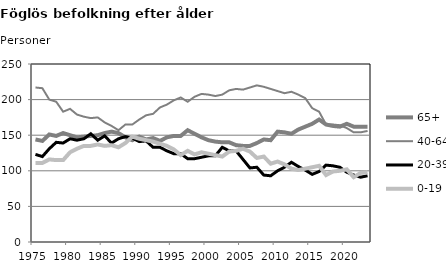
| Category | 65+ | 40-64 | 20-39 | 0-19 |
|---|---|---|---|---|
| 1975.0 | 144 | 217 | 123 | 111 |
| 1976.0 | 142 | 216 | 120 | 111 |
| 1977.0 | 151 | 200 | 131 | 116 |
| 1978.0 | 149 | 197 | 140 | 115 |
| 1979.0 | 153 | 183 | 139 | 115 |
| 1980.0 | 150 | 187 | 145 | 126 |
| 1981.0 | 147 | 179 | 143 | 131 |
| 1982.0 | 148 | 176 | 145 | 135 |
| 1983.0 | 149 | 174 | 152 | 135 |
| 1984.0 | 150 | 175 | 143 | 137 |
| 1985.0 | 153 | 168 | 149 | 135 |
| 1986.0 | 155 | 163 | 139 | 136 |
| 1987.0 | 153 | 157 | 145 | 133 |
| 1988.0 | 147 | 165 | 148 | 139 |
| 1989.0 | 143 | 165 | 146 | 148 |
| 1990.0 | 148 | 172 | 141 | 145 |
| 1991.0 | 144 | 178 | 142 | 143 |
| 1992.0 | 146 | 180 | 133 | 141 |
| 1993.0 | 142 | 189 | 133 | 138 |
| 1994.0 | 147 | 193 | 128 | 135 |
| 1995.0 | 149 | 199 | 124 | 130 |
| 1996.0 | 149 | 203 | 124 | 122 |
| 1997.0 | 157 | 197 | 117 | 128 |
| 1998.0 | 152 | 204 | 117 | 123 |
| 1999.0 | 147 | 208 | 119 | 126 |
| 2000.0 | 143 | 207 | 121 | 124 |
| 2001.0 | 141 | 205 | 121 | 122 |
| 2002.0 | 140 | 207 | 133 | 120 |
| 2003.0 | 140 | 213 | 128 | 127 |
| 2004.0 | 136 | 215 | 128 | 128 |
| 2005.0 | 135 | 214 | 116 | 131 |
| 2006.0 | 135 | 217 | 104 | 127 |
| 2007.0 | 139 | 220 | 105 | 118 |
| 2008.0 | 144 | 218 | 94 | 120 |
| 2009.0 | 143 | 215 | 93 | 110 |
| 2010.0 | 155 | 212 | 100 | 113 |
| 2011.0 | 154 | 209 | 105 | 109 |
| 2012.0 | 152 | 211 | 112 | 103 |
| 2013.0 | 158 | 207 | 106 | 101 |
| 2014.0 | 162 | 202 | 101 | 103 |
| 2015.0 | 166 | 188 | 95 | 105 |
| 2016.0 | 172 | 183 | 99 | 107 |
| 2017.0 | 165 | 165 | 108 | 94 |
| 2018.0 | 163 | 165 | 107 | 99 |
| 2019.0 | 162 | 164 | 105 | 100 |
| 2020.0 | 166 | 160 | 98 | 102 |
| 2021.0 | 162 | 154 | 94 | 91 |
| 2022.0 | 162 | 154 | 91 | 97 |
| 2023.0 | 162 | 156 | 93 | 98 |